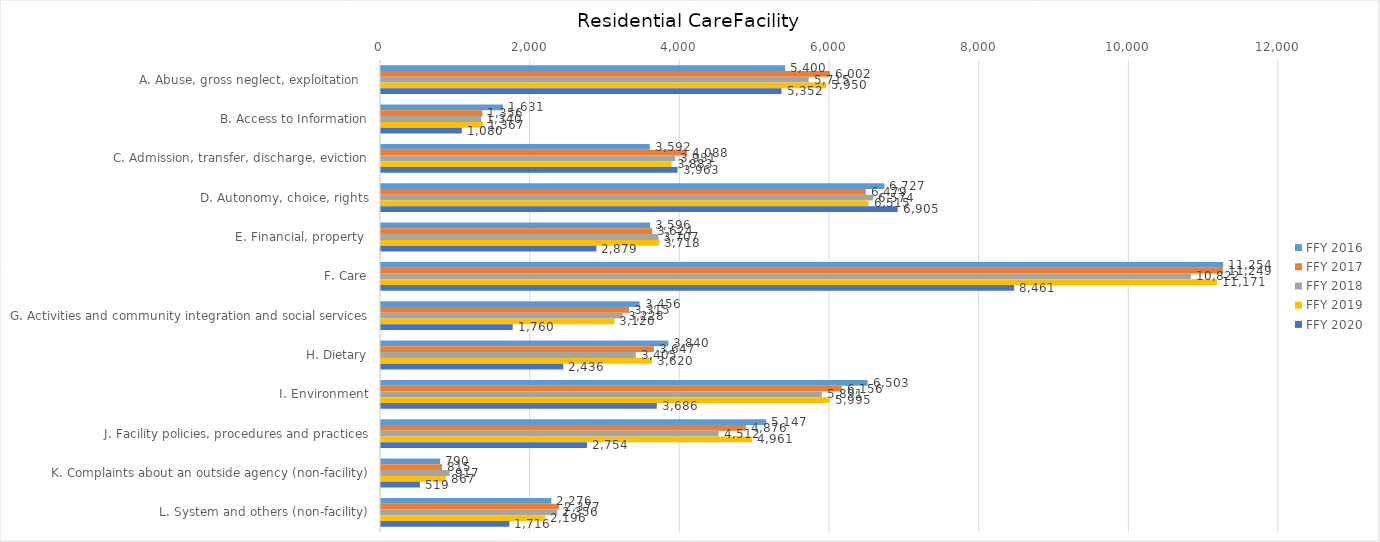
| Category | FFY 2016 | FFY 2017 | FFY 2018 | FFY 2019 | FFY 2020 |
|---|---|---|---|---|---|
| A. Abuse, gross neglect, exploitation   | 5400 | 6002 | 5715 | 5950 | 5352 |
| B. Access to Information | 1631 | 1356 | 1340 | 1367 | 1080 |
| C. Admission, transfer, discharge, eviction | 3592 | 4088 | 3931 | 3883 | 3963 |
| D. Autonomy, choice, rights | 6727 | 6479 | 6574 | 6515 | 6905 |
| E. Financial, property  | 3596 | 3624 | 3707 | 3718 | 2879 |
| F. Care | 11254 | 11249 | 10822 | 11171 | 8461 |
| G. Activities and community integration and social services | 3456 | 3315 | 3228 | 3120 | 1760 |
| H. Dietary | 3840 | 3647 | 3405 | 3620 | 2436 |
| I. Environment | 6503 | 6156 | 5891 | 5995 | 3686 |
| J. Facility policies, procedures and practices | 5147 | 4876 | 4512 | 4961 | 2754 |
| K. Complaints about an outside agency (non-facility) | 790 | 815 | 917 | 867 | 519 |
| L. System and others (non-facility) | 2276 | 2377 | 2356 | 2196 | 1716 |